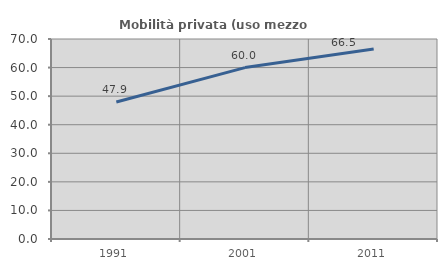
| Category | Mobilità privata (uso mezzo privato) |
|---|---|
| 1991.0 | 47.939 |
| 2001.0 | 59.99 |
| 2011.0 | 66.472 |